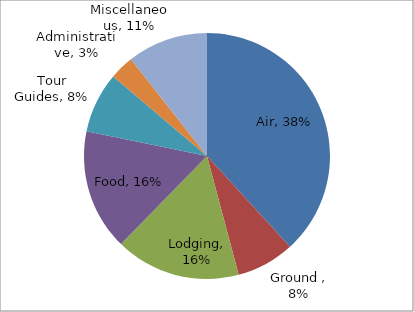
| Category | Series 0 |
|---|---|
| Air | 0.382 |
| Ground  | 0.076 |
| Lodging | 0.165 |
| Food | 0.159 |
| Tour Guides | 0.08 |
| Administrative | 0.032 |
| Miscellaneous | 0.106 |